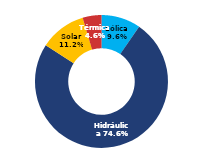
| Category | Sur |
|---|---|
| Eólica | 53.677 |
| Hidráulica | 418.873 |
| Solar | 63.145 |
| Térmica | 25.659 |